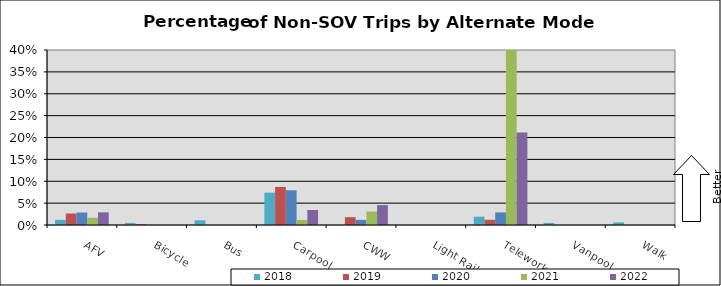
| Category | 2018 | 2019 | 2020 | 2021 | 2022 |
|---|---|---|---|---|---|
| AFV | 0.012 | 0.026 | 0.028 | 0.016 | 0.029 |
| Bicycle | 0.005 | 0.002 | 0 | 0 | 0 |
| Bus | 0.011 | 0 | 0 | 0 | 0 |
| Carpool | 0.074 | 0.087 | 0.079 | 0.012 | 0.034 |
| CWW | 0 | 0.018 | 0.012 | 0.031 | 0.045 |
| Light Rail | 0 | 0 | 0 | 0 | 0 |
| Telework | 0.019 | 0.012 | 0.029 | 0.437 | 0.211 |
| Vanpool | 0.005 | 0 | 0 | 0 | 0 |
| Walk | 0.006 | 0 | 0 | 0 | 0 |